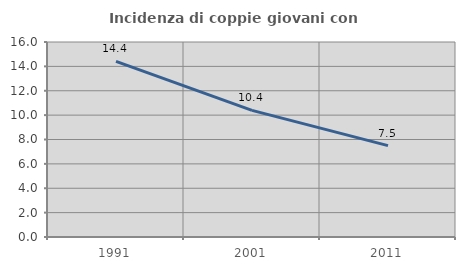
| Category | Incidenza di coppie giovani con figli |
|---|---|
| 1991.0 | 14.404 |
| 2001.0 | 10.39 |
| 2011.0 | 7.5 |